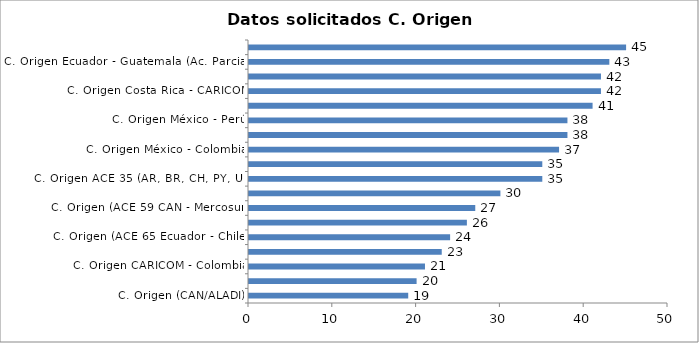
| Category | Series 0 |
|---|---|
| C. Origen (CAN/ALADI) | 19 |
| C. Origen Panamá - Colombia (Ac. Parcial) | 20 |
| C. Origen CARICOM - Colombia | 21 |
| C. Origen Chile - Colombia | 23 |
| C. Origen (ACE 65 Ecuador - Chile) | 24 |
| C. Origen Guatemala - Belize (Ac. Parcial) | 26 |
| C. Origen (ACE 59 CAN - Mercosur) | 27 |
| CARICOM | 30 |
| C. Origen ACE 35 (AR, BR, CH, PY, UR) | 35 |
| C. Origen ACE 18 MERCOSUR (AR, BR, PY, UR) y ACE 2 (BR, UR) | 35 |
| C. Origen México - Colombia | 37 |
| C. Origen ACE 60 Uruguay - México | 38 |
| C. Origen México - Perú | 38 |
| C. Origen Perú - Costa Rica y Perú - Panamá | 41 |
| C. Origen Costa Rica - CARICOM | 42 |
| C. Origen CARICOM - Rep. Dominicana | 42 |
| C. Origen Ecuador - Guatemala (Ac. Parcial) | 43 |
| C. Origen Panamá - Rep. Dominicana | 45 |